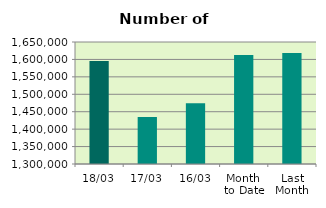
| Category | Series 0 |
|---|---|
| 18/03 | 1595824 |
| 17/03 | 1434790 |
| 16/03 | 1474268 |
| Month 
to Date | 1612947.571 |
| Last
Month | 1618522.4 |